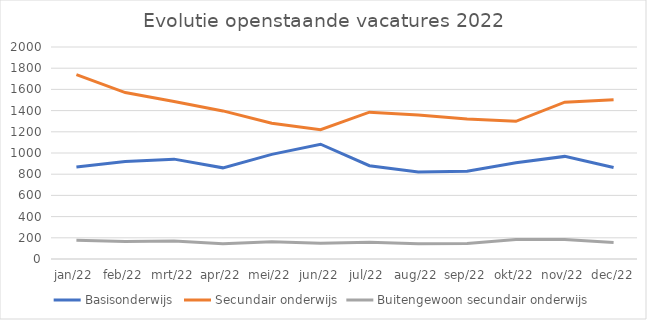
| Category | Basisonderwijs | Secundair onderwijs | Buitengewoon secundair onderwijs |
|---|---|---|---|
| jan/22 | 867 | 1739 | 177 |
| feb/22 | 919 | 1570 | 166 |
| mrt/22 | 942 | 1485 | 170 |
| apr/22 | 860 | 1397 | 144 |
| mei/22 | 987 | 1280 | 163 |
| jun/22 | 1083 | 1220 | 148 |
| jul/22 | 880 | 1385 | 158 |
| aug/22 | 820 | 1358 | 144 |
| sep/22 | 828 | 1321 | 147 |
| okt/22 | 908 | 1299 | 183 |
| nov/22 | 968 | 1479 | 184 |
| dec/22 | 863 | 1503 | 156 |